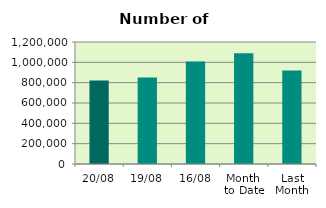
| Category | Series 0 |
|---|---|
| 20/08 | 821600 |
| 19/08 | 850346 |
| 16/08 | 1008016 |
| Month 
to Date | 1089970.857 |
| Last
Month | 919173.478 |